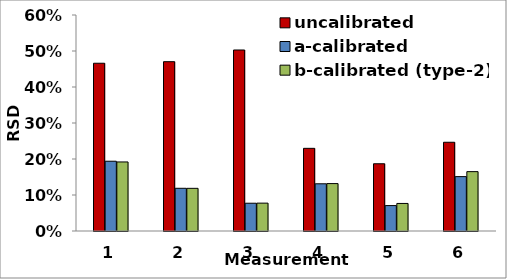
| Category | uncalibrated | a-calibrated | b-calibrated (type-2) |
|---|---|---|---|
| 0 | 0.466 | 0.194 | 0.192 |
| 1 | 0.47 | 0.119 | 0.119 |
| 2 | 0.503 | 0.077 | 0.077 |
| 3 | 0.23 | 0.131 | 0.132 |
| 4 | 0.187 | 0.071 | 0.077 |
| 5 | 0.247 | 0.151 | 0.165 |